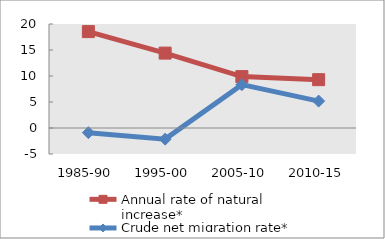
| Category | Annual rate of natural increase* | Crude net migration rate* |
|---|---|---|
| 1985-90 | 18.535 | -0.895 |
| 1995-00 | 14.403 | -2.144 |
| 2005-10 | 9.888 | 8.331 |
| 2010-15 | 9.293 | 5.172 |